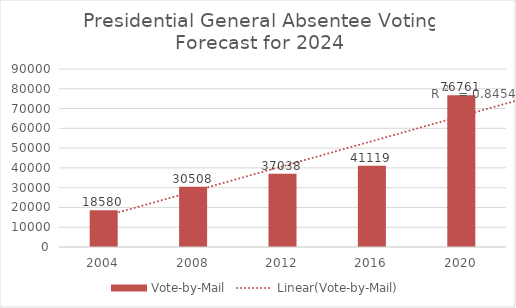
| Category | Vote-by-Mail |
|---|---|
| 2004.0 | 18580 |
| 2008.0 | 30508 |
| 2012.0 | 37038 |
| 2016.0 | 41119 |
| 2020.0 | 76761 |